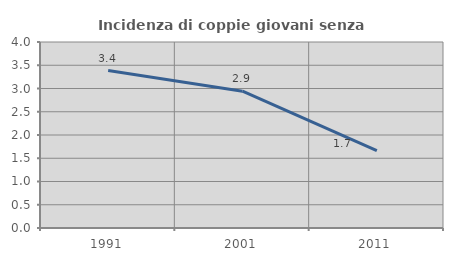
| Category | Incidenza di coppie giovani senza figli |
|---|---|
| 1991.0 | 3.386 |
| 2001.0 | 2.941 |
| 2011.0 | 1.665 |